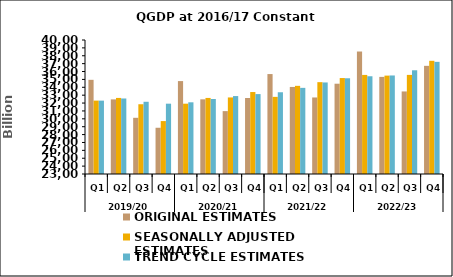
| Category | ORIGINAL ESTIMATES | SEASONALLY ADJUSTED ESTIMATES | TREND CYCLE ESTIMATES |
|---|---|---|---|
| 0 | 34947.349 | 32312.062 | 32308.27 |
| 1 | 32467.398 | 32651.486 | 32580.387 |
| 2 | 30129.393 | 31850.177 | 32162.352 |
| 3 | 28866.292 | 29713.613 | 31921.537 |
| 4 | 34787.484 | 31919.655 | 32095.224 |
| 5 | 32473.835 | 32650.429 | 32514.993 |
| 6 | 30977.989 | 32712.13 | 32887.561 |
| 7 | 32641.721 | 33398.472 | 33138.483 |
| 8 | 35679.532 | 32785.713 | 33370.812 |
| 9 | 34043.323 | 34183.762 | 33927.88 |
| 10 | 32708.577 | 34651.051 | 34614.325 |
| 11 | 34454.648 | 35172.938 | 35144.327 |
| 12 | 38539.652 | 35569.622 | 35399.943 |
| 13 | 35319.965 | 35481.616 | 35500.421 |
| 14 | 33473.323 | 35572.54 | 36158.978 |
| 15 | 36720.914 | 37361.354 | 37227.368 |